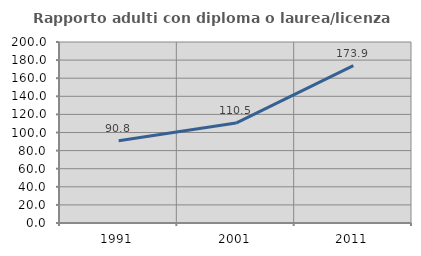
| Category | Rapporto adulti con diploma o laurea/licenza media  |
|---|---|
| 1991.0 | 90.826 |
| 2001.0 | 110.458 |
| 2011.0 | 173.881 |